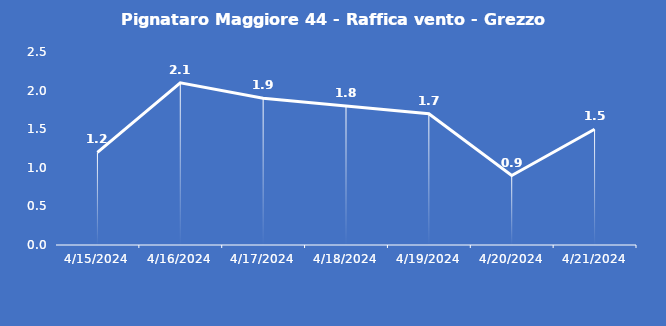
| Category | Pignataro Maggiore 44 - Raffica vento - Grezzo (m/s) |
|---|---|
| 4/15/24 | 1.2 |
| 4/16/24 | 2.1 |
| 4/17/24 | 1.9 |
| 4/18/24 | 1.8 |
| 4/19/24 | 1.7 |
| 4/20/24 | 0.9 |
| 4/21/24 | 1.5 |